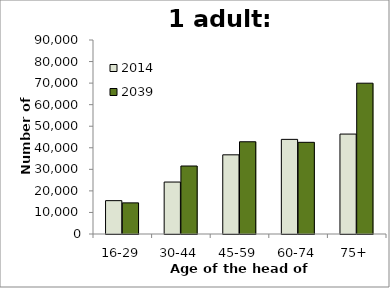
| Category | 2014 | 2039 |
|---|---|---|
| 16-29 | 15470 | 14443 |
| 30-44 | 24108 | 31542 |
| 45-59 | 36733 | 42792 |
| 60-74 | 43904 | 42529 |
| 75+ | 46359 | 69961 |